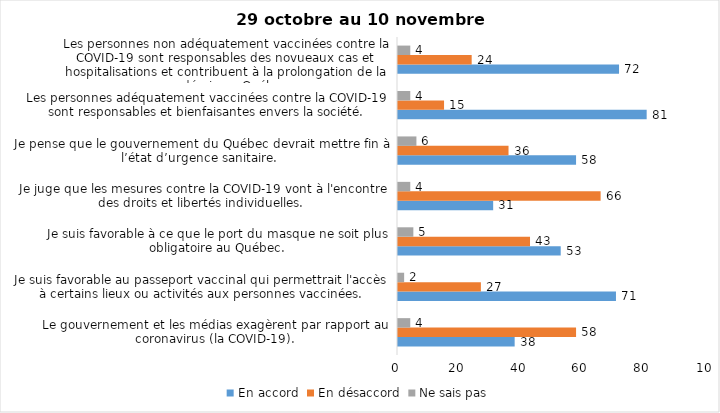
| Category | En accord | En désaccord | Ne sais pas |
|---|---|---|---|
| Le gouvernement et les médias exagèrent par rapport au coronavirus (la COVID-19). | 38 | 58 | 4 |
| Je suis favorable au passeport vaccinal qui permettrait l'accès à certains lieux ou activités aux personnes vaccinées. | 71 | 27 | 2 |
| Je suis favorable à ce que le port du masque ne soit plus obligatoire au Québec. | 53 | 43 | 5 |
| Je juge que les mesures contre la COVID-19 vont à l'encontre des droits et libertés individuelles.  | 31 | 66 | 4 |
| Je pense que le gouvernement du Québec devrait mettre fin à l’état d’urgence sanitaire.  | 58 | 36 | 6 |
| Les personnes adéquatement vaccinées contre la COVID-19 sont responsables et bienfaisantes envers la société. | 81 | 15 | 4 |
| Les personnes non adéquatement vaccinées contre la COVID-19 sont responsables des novueaux cas et hospitalisations et contribuent à la prolongation de la pandémie au Québec. | 72 | 24 | 4 |